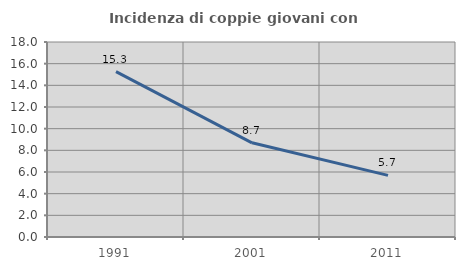
| Category | Incidenza di coppie giovani con figli |
|---|---|
| 1991.0 | 15.271 |
| 2001.0 | 8.696 |
| 2011.0 | 5.688 |